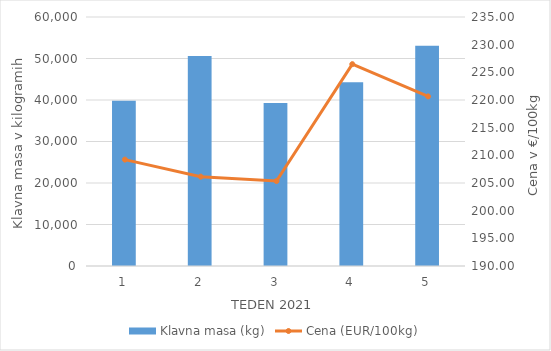
| Category | Klavna masa (kg) |
|---|---|
| 1.0 | 39814 |
| 2.0 | 50603 |
| 3.0 | 39295 |
| 4.0 | 44250 |
| 5.0 | 53061 |